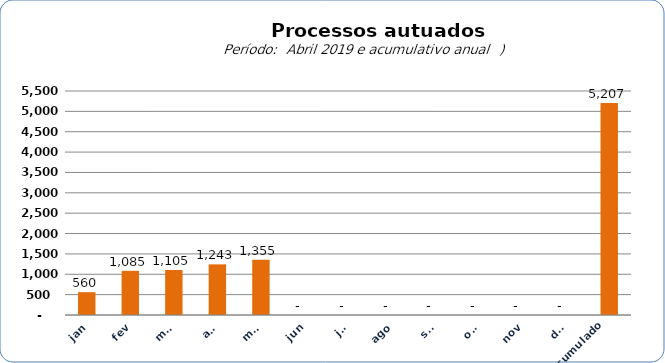
| Category |  6.735   4.276   7.967   6.893   5.569   5.644   6.997   12.080   560   1.085   1.105   1.243   1.355   -     -     -     -     -     -     -     5.207  |
|---|---|
| jan | 560 |
| fev | 1085 |
| mar | 1105 |
| abr | 1243 |
| mai | 1355 |
| jun | 0 |
| jul | 0 |
| ago | 0 |
| set | 0 |
| out | 0 |
| nov | 0 |
| dez | 0 |
| Acumulado
 | 5207 |